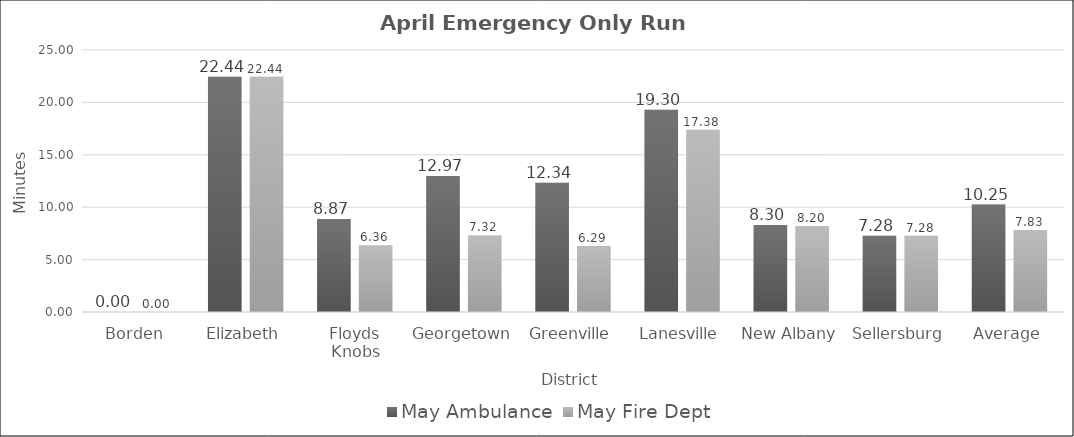
| Category | May |
|---|---|
| Borden | 0 |
| Elizabeth | 22.439 |
| Floyds Knobs | 6.357 |
| Georgetown | 7.319 |
| Greenville | 6.288 |
| Lanesville | 17.383 |
| New Albany | 8.203 |
| Sellersburg | 7.279 |
| Average | 7.831 |